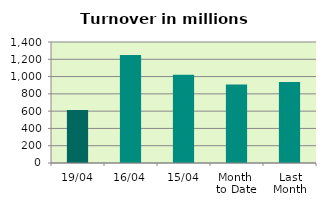
| Category | Series 0 |
|---|---|
| 19/04 | 613.615 |
| 16/04 | 1248.747 |
| 15/04 | 1020.442 |
| Month 
to Date | 907.561 |
| Last
Month | 937.305 |